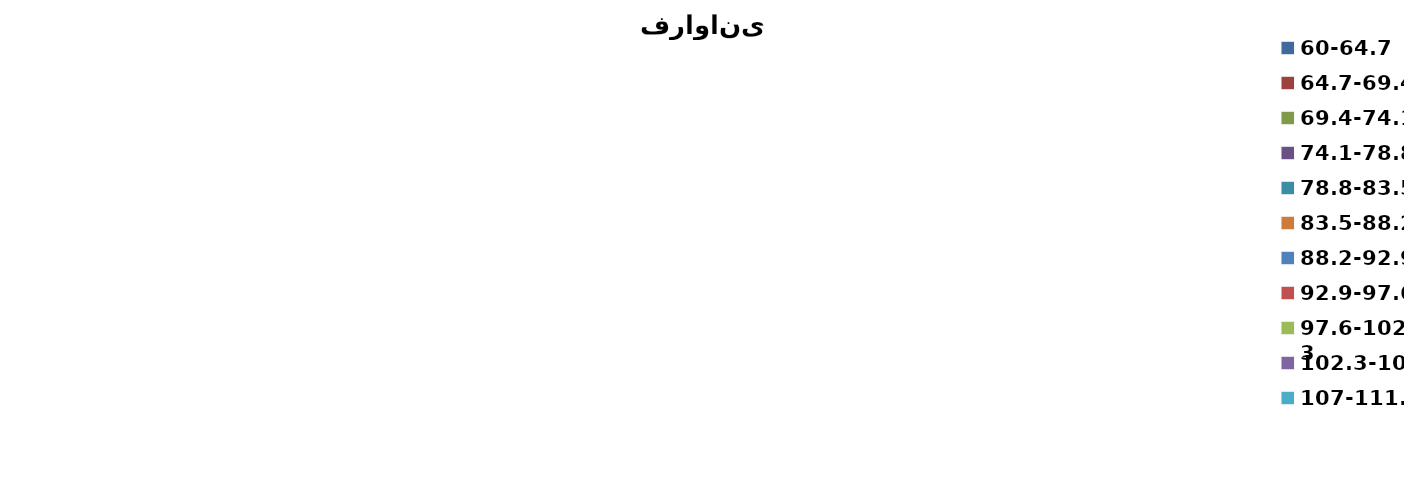
| Category | درصد فراوانی نسبی |
|---|---|
| 60-64.7 | 0.019 |
| 64.7-69.4 | 0.038 |
| 69.4-74.1 | 0.057 |
| 74.1-78.8 | 0.038 |
| 78.8-83.5 | 0.067 |
| 83.5-88.2 | 0.076 |
| 88.2-92.9 | 0.114 |
| 92.9-97.6 | 0.086 |
| 97.6-102.3 | 0.152 |
| 102.3-107 | 0.105 |
| 107-111.7 | 0.095 |
| 111.7-116.4 | 0.067 |
| 116.4-121.1 | 0.029 |
| 121.1-125.8 | 0.029 |
| 125.8-130.5 | 0.029 |